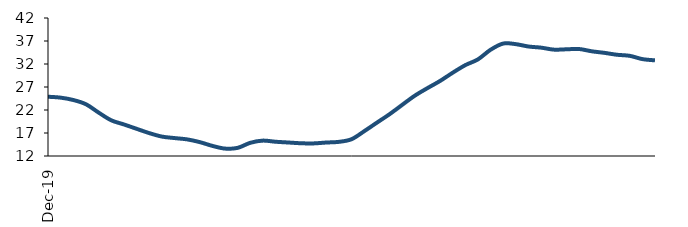
| Category | Series 0 |
|---|---|
| 2019-12-01 | 24.882 |
| 2020-01-01 | 24.685 |
| 2020-02-01 | 24.173 |
| 2020-03-01 | 23.249 |
| 2020-04-01 | 21.444 |
| 2020-05-01 | 19.761 |
| 2020-06-01 | 18.865 |
| 2020-07-01 | 17.917 |
| 2020-08-01 | 16.982 |
| 2020-09-01 | 16.225 |
| 2020-10-01 | 15.898 |
| 2020-11-01 | 15.612 |
| 2020-12-01 | 15.02 |
| 2021-01-01 | 14.199 |
| 2021-02-01 | 13.61 |
| 2021-03-01 | 13.772 |
| 2021-04-01 | 14.873 |
| 2021-05-01 | 15.345 |
| 2021-06-01 | 15.098 |
| 2021-07-01 | 14.935 |
| 2021-08-01 | 14.77 |
| 2021-09-01 | 14.738 |
| 2021-10-01 | 14.927 |
| 2021-11-01 | 15.076 |
| 2021-12-01 | 15.646 |
| 2022-01-01 | 17.378 |
| 2022-02-01 | 19.236 |
| 2022-03-01 | 21.066 |
| 2022-04-01 | 23.099 |
| 2022-05-01 | 25.101 |
| 2022-06-01 | 26.747 |
| 2022-07-01 | 28.308 |
| 2022-08-01 | 30.099 |
| 2022-09-01 | 31.754 |
| 2022-10-01 | 33.005 |
| 2022-11-01 | 35.104 |
| 2022-12-01 | 36.448 |
| 2023-01-01 | 36.313 |
| 2023-02-01 | 35.8 |
| 2023-03-01 | 35.553 |
| 2023-04-01 | 35.126 |
| 2023-05-01 | 35.194 |
| 2023-06-01 | 35.259 |
| 2023-07-01 | 34.763 |
| 2023-08-01 | 34.422 |
| 2023-09-01 | 34.006 |
| 2023-10-01 | 33.778 |
| 2023-11-01 | 33.067 |
| 2023-12-01 | 32.794 |